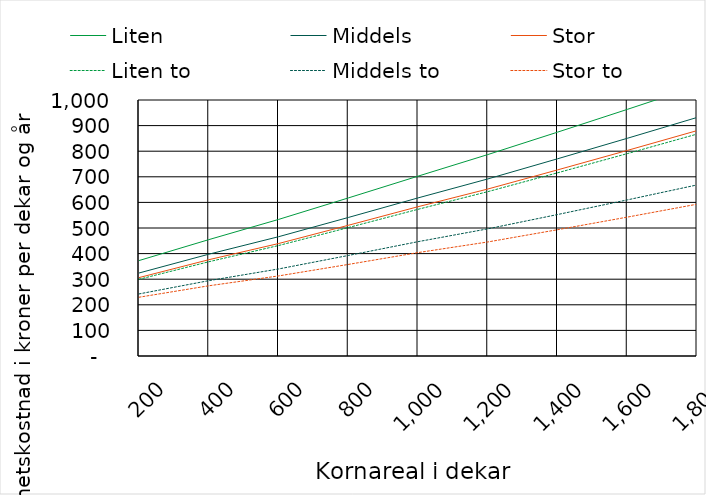
| Category | Liten | Middels | Stor | Liten to | Middels to | Stor to |
|---|---|---|---|---|---|---|
| 200.0 | 372.753 | 324.161 | 306.214 | 299.638 | 242.429 | 229.554 |
| 400.0 | 454.492 | 397.586 | 376.068 | 368.087 | 294.25 | 274.232 |
| 600.0 | 533.438 | 465.895 | 439.247 | 431.463 | 339.945 | 312.72 |
| 800.0 | 617.318 | 541.059 | 510.539 | 501.563 | 392.613 | 357.645 |
| 1000.0 | 702.513 | 617.539 | 583.146 | 572.979 | 446.598 | 403.885 |
| 1200.0 | 786.747 | 691.557 | 652.196 | 641.925 | 496.675 | 445.426 |
| 1400.0 | 874.373 | 770.295 | 726.927 | 715.57 | 552.545 | 493.28 |
| 1600.0 | 963.315 | 850.348 | 802.973 | 790.532 | 609.73 | 542.45 |
| 1800.0 | 1053.572 | 931.718 | 880.334 | 866.809 | 668.231 | 592.935 |